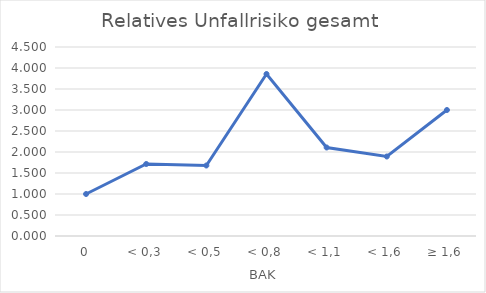
| Category | Series 0 |
|---|---|
| 0 | 1 |
| < 0,3 | 1.714 |
| < 0,5 | 1.679 |
| < 0,8 | 3.857 |
| < 1,1 | 2.107 |
| < 1,6 | 1.893 |
| ≥ 1,6 | 3 |